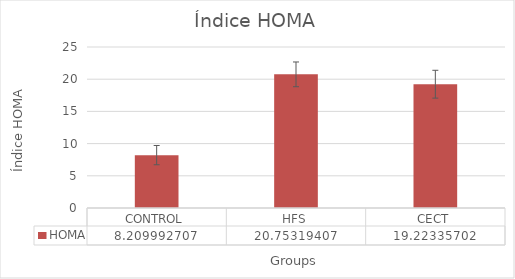
| Category | HOMA |
|---|---|
| CONTROL | 8.21 |
| HFS | 20.753 |
| CECT | 19.223 |